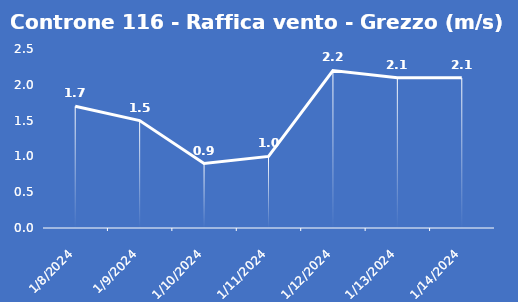
| Category | Controne 116 - Raffica vento - Grezzo (m/s) |
|---|---|
| 1/8/24 | 1.7 |
| 1/9/24 | 1.5 |
| 1/10/24 | 0.9 |
| 1/11/24 | 1 |
| 1/12/24 | 2.2 |
| 1/13/24 | 2.1 |
| 1/14/24 | 2.1 |